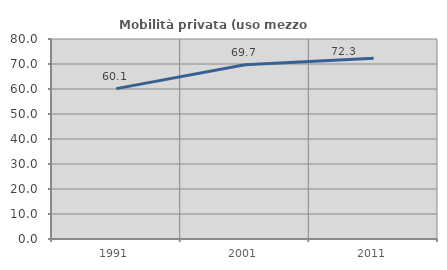
| Category | Mobilità privata (uso mezzo privato) |
|---|---|
| 1991.0 | 60.141 |
| 2001.0 | 69.69 |
| 2011.0 | 72.295 |